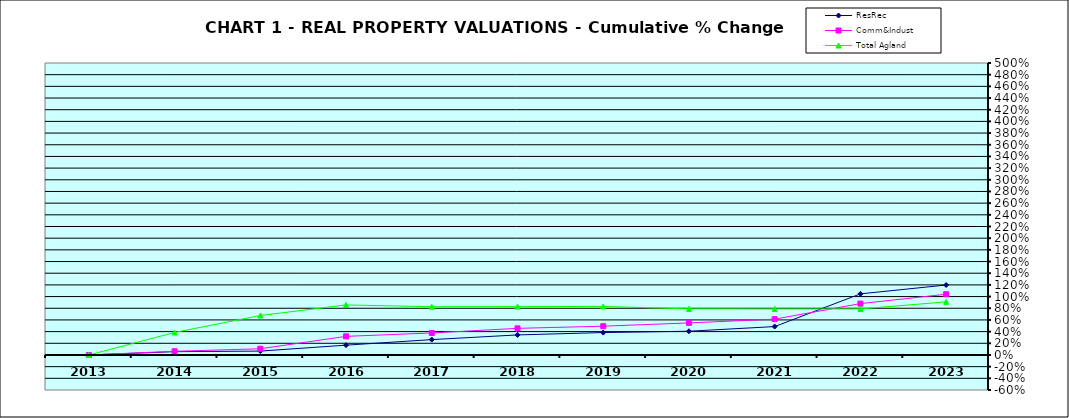
| Category | ResRec | Comm&Indust | Total Agland |
|---|---|---|---|
| 2013.0 | 0 | 0 | 0 |
| 2014.0 | 0.057 | 0.063 | 0.385 |
| 2015.0 | 0.066 | 0.106 | 0.676 |
| 2016.0 | 0.168 | 0.319 | 0.857 |
| 2017.0 | 0.263 | 0.377 | 0.826 |
| 2018.0 | 0.343 | 0.456 | 0.828 |
| 2019.0 | 0.384 | 0.493 | 0.831 |
| 2020.0 | 0.406 | 0.549 | 0.789 |
| 2021.0 | 0.486 | 0.614 | 0.787 |
| 2022.0 | 1.046 | 0.879 | 0.788 |
| 2023.0 | 1.198 | 1.04 | 0.909 |